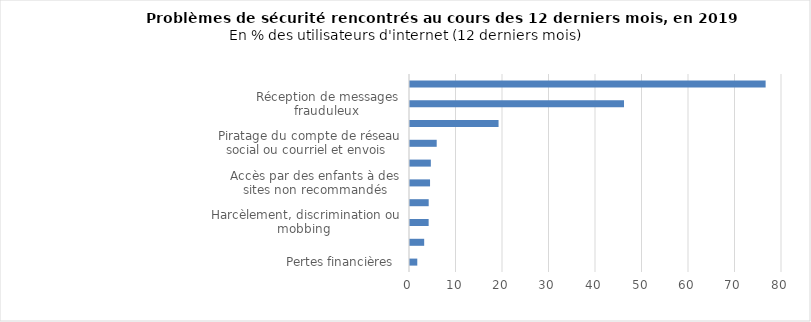
| Category | 2019 |
|---|---|
| Pertes financières  | 1.565 |
| Usurpation d'identité | 3.049 |
| Harcèlement, discrimination ou mobbing  | 4.01 |
| Perte de documents suite à un virus ou autre infection | 4.019 |
| Accès par des enfants à des sites non recommandés | 4.311 |
| Utilisation frauduleuse de votre carte de crédit ou de débit | 4.482 |
| Piratage du compte de réseau social ou courriel et envois  | 5.742 |
| Redirection vers de faux sites internet demandant des informations personnelles | 19.043 |
| Réception de messages frauduleux  | 46.023 |
| Spam | 76.478 |